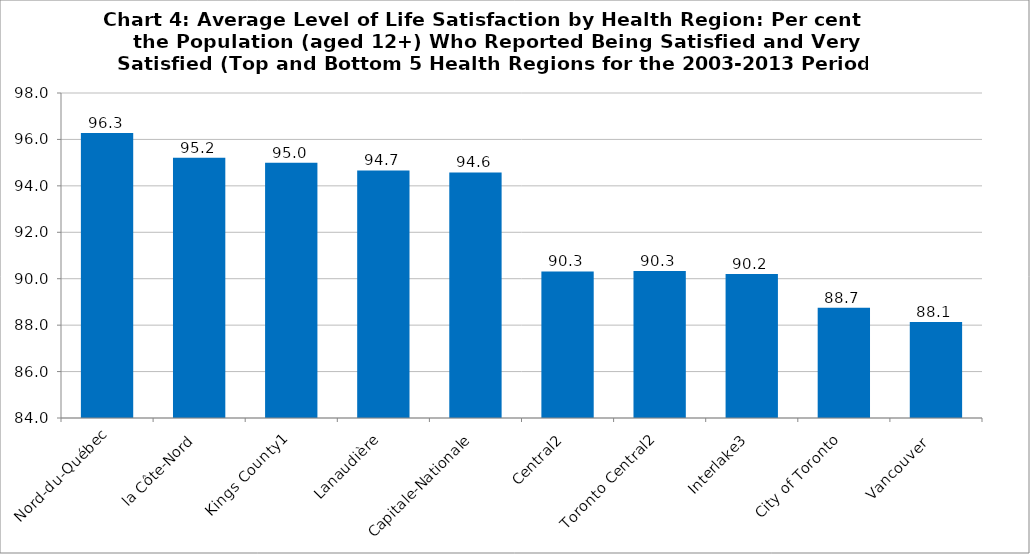
| Category | Series 0 | Series 1 | Series 2 | Series 3 | Series 4 | Series 5 | Series 6 | Series 7 | Series 8 | Series 9 |
|---|---|---|---|---|---|---|---|---|---|---|
| Nord-du-Québec |  |  |  |  |  |  |  |  |  | 96.278 |
| la Côte-Nord |  |  |  |  |  |  |  |  |  | 95.211 |
| Kings County1 |  |  |  |  |  |  |  |  |  | 95 |
| Lanaudière |  |  |  |  |  |  |  |  |  | 94.667 |
| Capitale-Nationale |  |  |  |  |  |  |  |  |  | 94.578 |
| Central2 |  |  |  |  |  |  |  |  |  | 90.312 |
| Toronto Central2 |  |  |  |  |  |  |  |  |  | 90.338 |
| Interlake3 |  |  |  |  |  |  |  |  |  | 90.2 |
| City of Toronto |  |  |  |  |  |  |  |  |  | 88.744 |
| Vancouver  |  |  |  |  |  |  |  |  |  | 88.133 |